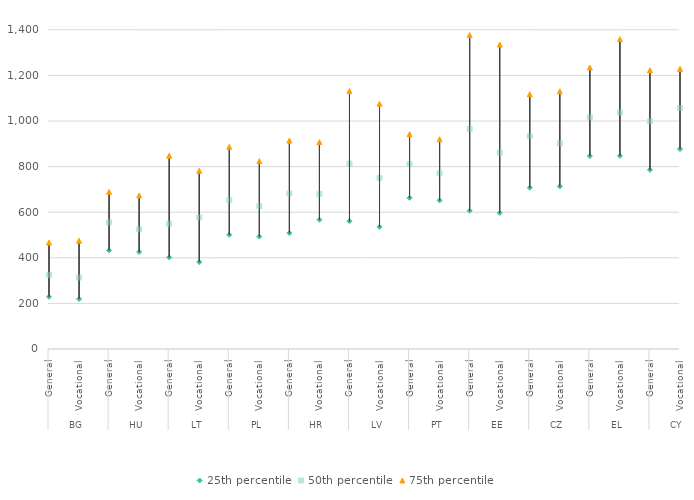
| Category | 25th percentile | 50th percentile | 75th percentile |
|---|---|---|---|
| 0 | 228.698 | 325.205 | 466.987 |
| 1 | 219.334 | 313.348 | 474.941 |
| 2 | 432.521 | 555.977 | 689.407 |
| 3 | 425.506 | 525.03 | 673.649 |
| 4 | 401.734 | 549.6 | 847.637 |
| 5 | 381.241 | 576.951 | 781.905 |
| 6 | 501.135 | 653.062 | 886.882 |
| 7 | 492.928 | 626.869 | 823.959 |
| 8 | 508.573 | 681.923 | 914.402 |
| 9 | 566.911 | 680.487 | 907.426 |
| 10 | 560.4 | 813.054 | 1131.35 |
| 11 | 535.908 | 750.093 | 1075.73 |
| 12 | 662.922 | 810.379 | 942.029 |
| 13 | 651.685 | 771.084 | 919.895 |
| 14 | 606.382 | 964.937 | 1376.889 |
| 15 | 596.705 | 860.996 | 1335.523 |
| 16 | 707.555 | 933.431 | 1117.576 |
| 17 | 712.872 | 902.15 | 1130.323 |
| 18 | 846.17 | 1016.473 | 1234.902 |
| 19 | 847.061 | 1037.217 | 1358.929 |
| 20 | 785.857 | 998.833 | 1222.833 |
| 21 | 877 | 1057.333 | 1228.773 |